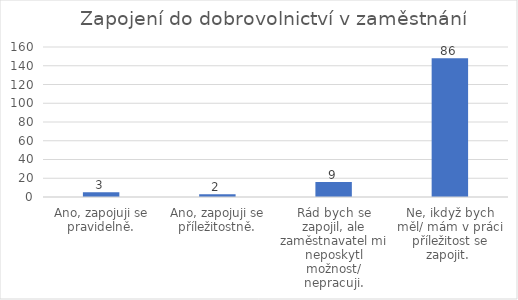
| Category | Počet respondentů |
|---|---|
| Ano, zapojuji se pravidelně. | 5 |
| Ano, zapojuji se příležitostně. | 3 |
| Rád bych se zapojil, ale zaměstnavatel mi neposkytl možnost/ nepracuji. | 16 |
| Ne, ikdyž bych měl/ mám v práci příležitost se zapojit.  | 148 |